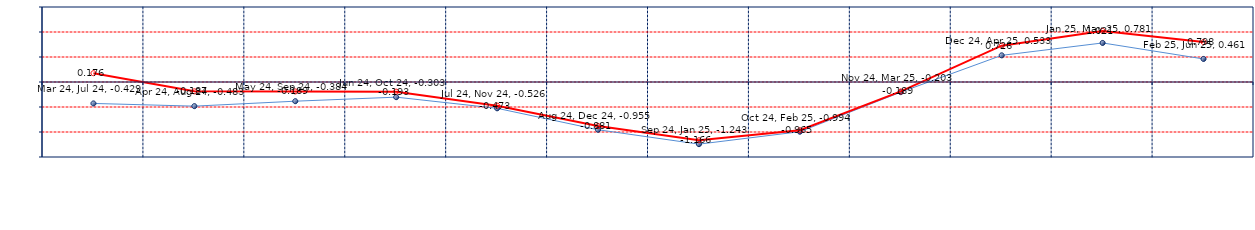
| Category | Last | Settlement |
|---|---|---|
| Mar 24, Jul 24 | -0.429 | 0.176 |
| Apr 24, Aug 24 | -0.483 | -0.187 |
| May 24, Sep 24 | -0.384 | -0.189 |
| Jun 24, Oct 24 | -0.303 | -0.193 |
| Jul 24, Nov 24 | -0.526 | -0.473 |
| Aug 24, Dec 24 | -0.955 | -0.881 |
| Sep 24, Jan 25 | -1.243 | -1.166 |
| Oct 24, Feb 25 | -0.994 | -0.965 |
| Nov 24, Mar 25 | -0.203 | -0.189 |
| Dec 24, Apr 25 | 0.533 | 0.726 |
| Jan 25, May 25 | 0.781 | 1.021 |
| Feb 25, Jun 25 | 0.461 | 0.798 |